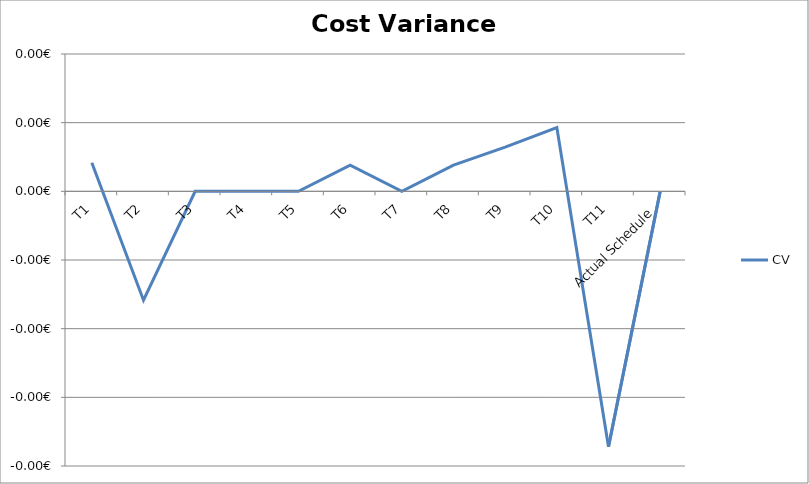
| Category | CV |
|---|---|
| T1 | 0 |
| T2 | 0 |
| T3 | 0 |
| T4 | 0 |
| T5 | 0 |
| T6 | 0 |
| T7 | 0 |
| T8 | 0 |
| T9 | 0 |
| T10 | 0 |
| T11 | -0.001 |
| Actual Schedule | 0 |